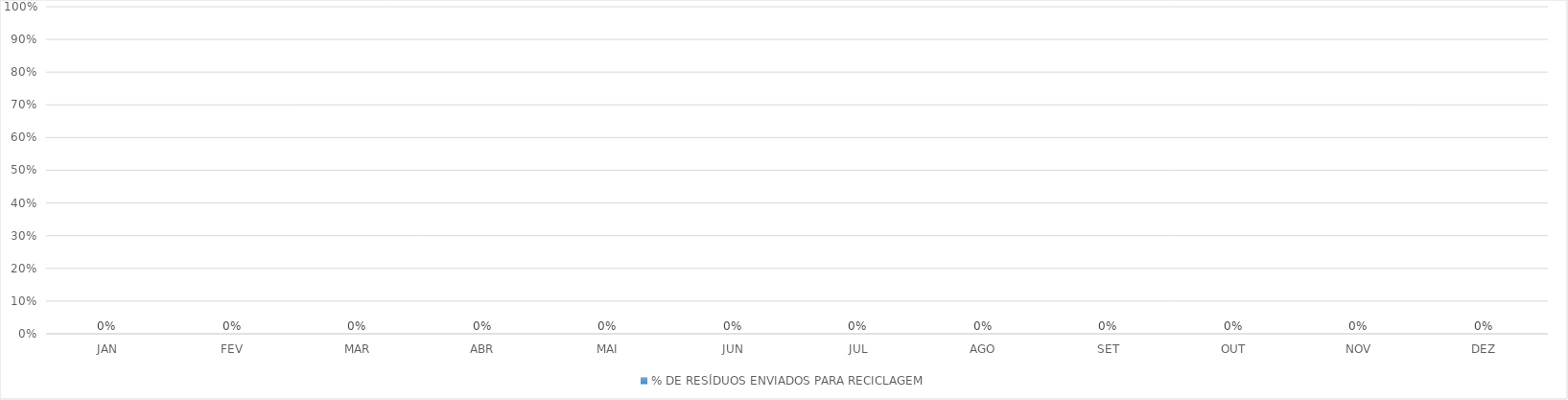
| Category | % DE RESÍDUOS ENVIADOS PARA RECICLAGEM |
|---|---|
| JAN | 0 |
| FEV | 0 |
| MAR | 0 |
| ABR | 0 |
| MAI | 0 |
| JUN | 0 |
| JUL | 0 |
| AGO | 0 |
| SET | 0 |
| OUT | 0 |
| NOV | 0 |
| DEZ | 0 |